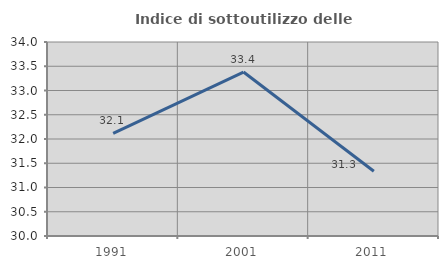
| Category | Indice di sottoutilizzo delle abitazioni  |
|---|---|
| 1991.0 | 32.116 |
| 2001.0 | 33.381 |
| 2011.0 | 31.334 |